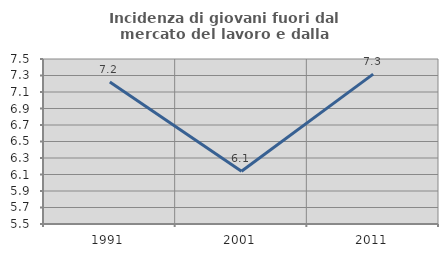
| Category | Incidenza di giovani fuori dal mercato del lavoro e dalla formazione  |
|---|---|
| 1991.0 | 7.22 |
| 2001.0 | 6.14 |
| 2011.0 | 7.317 |